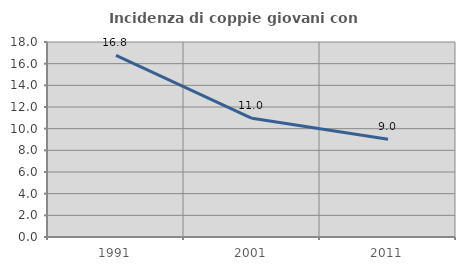
| Category | Incidenza di coppie giovani con figli |
|---|---|
| 1991.0 | 16.774 |
| 2001.0 | 10.959 |
| 2011.0 | 9.032 |